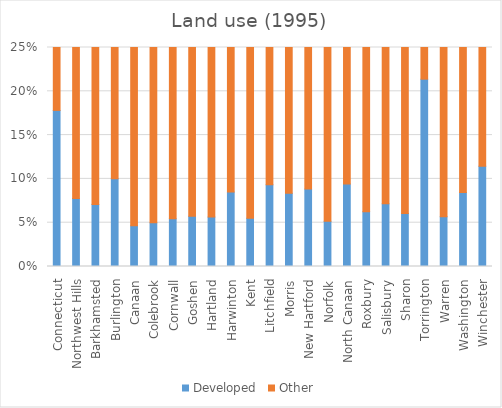
| Category | Developed | Other |
|---|---|---|
| Connecticut | 885.5 | 4083.7 |
| Northwest Hills | 40156 | 476948 |
| Barkhamsted | 1757 | 23020 |
| Burlington | 1956 | 17544 |
| Canaan | 984 | 20228 |
| Colebrook | 1049 | 19997 |
| Cornwall | 1619 | 28098 |
| Goshen | 1658 | 27277 |
| Hartland | 1237 | 20697 |
| Harwinton | 1692 | 18217 |
| Kent | 1752 | 30057 |
| Litchfield | 3398 | 33039 |
| Morris | 999 | 10963 |
| New Hartford | 2152 | 22210 |
| Norfolk | 1529 | 28134 |
| North Canaan | 1176 | 11320 |
| Roxbury | 1052 | 15774 |
| Salisbury | 2754 | 35758 |
| Sharon | 2309 | 35901 |
| Torrington | 5516 | 20277 |
| Warren | 1000 | 16599 |
| Washington | 2086 | 22643 |
| Winchester | 2481 | 19195 |